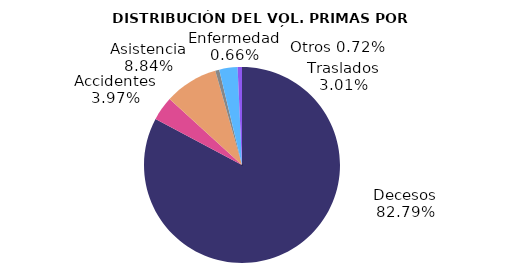
| Category | Series 0 |
|---|---|
| Decesos | 0.828 |
| Accidentes | 0.04 |
| Asistencia | 0.088 |
| Enfermedad | 0.007 |
| Traslados | 0.03 |
| Otros | 0.007 |